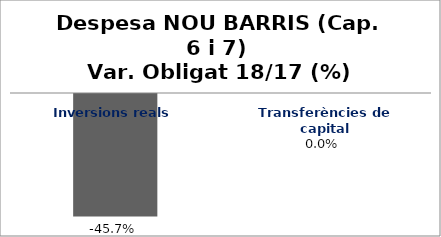
| Category | Series 0 |
|---|---|
| Inversions reals | -0.457 |
| Transferències de capital | 0 |